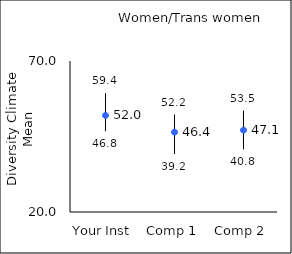
| Category | 25th percentile | 75th percentile | Mean |
|---|---|---|---|
| Your Inst | 46.8 | 59.4 | 51.98 |
| Comp 1 | 39.2 | 52.2 | 46.44 |
| Comp 2 | 40.8 | 53.5 | 47.1 |